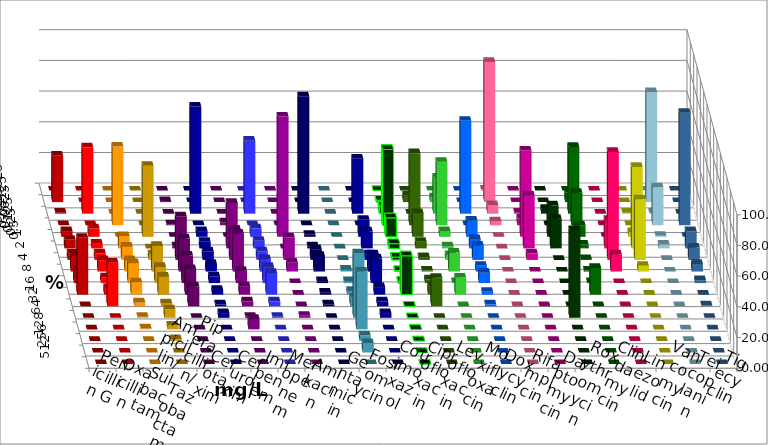
| Category | Penicillin G | Oxacillin | Ampicillin/ Sulbactam | Piperacillin/ Tazobactam | Cefotaxim | Cefuroxim | Imipenem | Meropenem | Amikacin | Gentamicin | Fosfomycin | Cotrimoxazol | Ciprofloxacin | Levofloxacin | Moxifloxacin | Doxycyclin | Rifampicin | Daptomycin | Roxythromycin | Clindamycin | Linezolid | Vancomycin | Teicoplanin | Tigecyclin |
|---|---|---|---|---|---|---|---|---|---|---|---|---|---|---|---|---|---|---|---|---|---|---|---|---|
| 0.015625 | 0 | 0 | 0 | 0 | 0 | 0 | 0 | 0 | 0 | 0 | 0 | 0 | 0 | 0 | 0 | 0 | 0.617 | 0 | 0 | 0 | 0 | 0 | 0 | 0 |
| 0.03125 | 30.247 | 0 | 0 | 0 | 0.617 | 0 | 0 | 0 | 0 | 0 | 0 | 0 | 1.235 | 4.321 | 3.086 | 0 | 91.358 | 0 | 0 | 6.211 | 0 | 0 | 0 | 71.605 |
| 0.0625 | 0.617 | 43.21 | 0 | 0 | 0 | 0 | 69.753 | 47.531 | 0 | 76.433 | 0 | 35.802 | 4.938 | 0 | 23.457 | 60.494 | 5.556 | 0.617 | 3.106 | 43.478 | 0 | 0.617 | 0 | 0.617 |
| 0.125 | 0 | 0 | 51.235 | 0 | 0.617 | 1.852 | 0 | 0 | 0 | 0 | 0 | 0 | 49.383 | 46.914 | 41.358 | 0 | 2.469 | 4.321 | 0 | 21.118 | 0 | 0 | 73.292 | 24.691 |
| 0.25 | 3.704 | 5.556 | 0 | 46.296 | 0 | 0 | 3.704 | 5.556 | 78.344 | 1.274 | 0 | 11.111 | 12.346 | 15.432 | 3.704 | 10.494 | 0 | 56.173 | 20.497 | 7.453 | 0 | 3.086 | 0 | 0.617 |
| 0.5 | 5.556 | 3.086 | 8.025 | 0 | 1.235 | 29.63 | 4.321 | 4.938 | 0 | 1.274 | 0 | 11.111 | 3.086 | 4.321 | 1.235 | 6.173 | 0 | 34.568 | 19.255 | 2.484 | 18.519 | 53.086 | 11.18 | 2.469 |
| 1.0 | 4.321 | 4.321 | 8.642 | 3.704 | 28.395 | 19.753 | 5.556 | 5.556 | 14.65 | 7.006 | 0 | 3.704 | 1.852 | 1.852 | 3.086 | 9.259 | 0 | 4.321 | 0 | 0.621 | 70.37 | 39.506 | 8.075 | 0 |
| 2.0 | 9.877 | 7.407 | 7.407 | 16.667 | 21.605 | 24.691 | 4.938 | 8.025 | 5.732 | 10.191 | 1.235 | 11.111 | 0.617 | 0.617 | 12.346 | 3.704 | 0 | 0 | 0 | 0.621 | 11.111 | 3.704 | 4.969 | 0 |
| 4.0 | 8.642 | 3.704 | 12.963 | 10.494 | 17.901 | 8.025 | 4.321 | 10.494 | 0 | 1.274 | 1.235 | 16.049 | 1.235 | 2.469 | 0.617 | 6.79 | 0 | 0 | 0 | 0.621 | 0 | 0 | 1.863 | 0 |
| 8.0 | 37.037 | 4.321 | 8.025 | 11.728 | 16.667 | 5.556 | 3.086 | 14.198 | 0 | 1.274 | 2.469 | 4.938 | 25.309 | 5.556 | 11.111 | 1.852 | 0 | 0 | 0 | 17.391 | 0 | 0 | 0 | 0 |
| 16.0 | 0 | 28.395 | 2.469 | 1.852 | 12.963 | 3.086 | 1.235 | 3.086 | 0 | 1.274 | 5.556 | 3.086 | 0 | 18.519 | 0 | 1.235 | 0 | 0 | 0 | 0 | 0 | 0 | 0.621 | 0 |
| 32.0 | 0 | 0 | 0.617 | 5.556 | 0 | 0.617 | 3.086 | 0.617 | 1.274 | 0 | 41.975 | 3.086 | 0 | 0 | 0 | 0 | 0 | 0 | 57.143 | 0 | 0 | 0 | 0 | 0 |
| 64.0 | 0 | 0 | 0.617 | 2.469 | 0 | 6.79 | 0 | 0 | 0 | 0 | 37.654 | 0 | 0 | 0 | 0 | 0 | 0 | 0 | 0 | 0 | 0 | 0 | 0 | 0 |
| 128.0 | 0 | 0 | 0 | 1.235 | 0 | 0 | 0 | 0 | 0 | 0 | 3.704 | 0 | 0 | 0 | 0 | 0 | 0 | 0 | 0 | 0 | 0 | 0 | 0 | 0 |
| 256.0 | 0 | 0 | 0 | 0 | 0 | 0 | 0 | 0 | 0 | 0 | 6.173 | 0 | 0 | 0 | 0 | 0 | 0 | 0 | 0 | 0 | 0 | 0 | 0 | 0 |
| 512.0 | 0 | 0 | 0 | 0 | 0 | 0 | 0 | 0 | 0 | 0 | 0 | 0 | 0 | 0 | 0 | 0 | 0 | 0 | 0 | 0 | 0 | 0 | 0 | 0 |